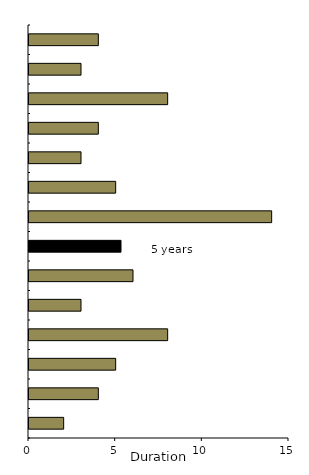
| Category | Series 0 |
|---|---|
| 0 | 2 |
| 1 | 4 |
| 2 | 5 |
| 3 | 8 |
| 4 | 3 |
| 5 | 6 |
| 6 | 5.308 |
| 7 | 14 |
| 8 | 5 |
| 9 | 3 |
| 10 | 4 |
| 11 | 8 |
| 12 | 3 |
| 13 | 4 |